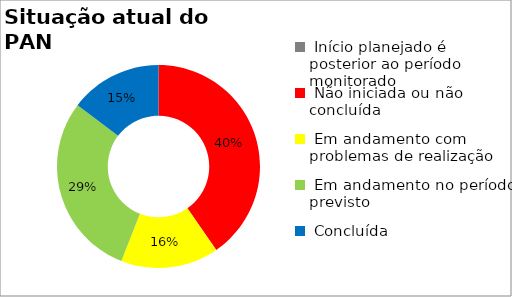
| Category | Series 0 |
|---|---|
|  Início planejado é posterior ao período monitorado | 0 |
|  Não iniciada ou não concluída | 0.404 |
|  Em andamento com problemas de realização | 0.156 |
|  Em andamento no período previsto  | 0.294 |
|  Concluída | 0.147 |